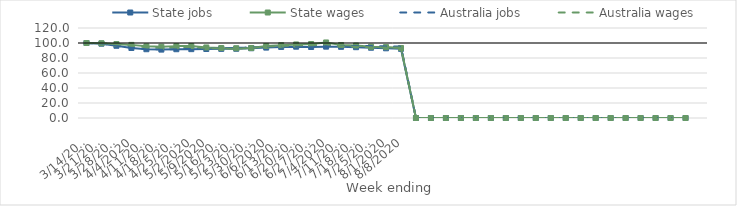
| Category | State jobs | State wages | Australia jobs | Australia wages |
|---|---|---|---|---|
| 14/03/2020 | 100 | 100 | 100 | 100 |
| 21/03/2020 | 99.082 | 99.651 | 99.296 | 99.679 |
| 28/03/2020 | 96.295 | 98.614 | 96.376 | 98.416 |
| 04/04/2020 | 93.333 | 97.498 | 93.719 | 96.743 |
| 11/04/2020 | 91.701 | 95.534 | 91.949 | 94.153 |
| 18/04/2020 | 91.188 | 95.025 | 91.46 | 94.028 |
| 25/04/2020 | 91.693 | 95.834 | 91.774 | 94.242 |
| 02/05/2020 | 91.81 | 96.005 | 92.164 | 94.699 |
| 09/05/2020 | 91.983 | 94.061 | 92.706 | 93.349 |
| 16/05/2020 | 92.169 | 93.309 | 93.235 | 92.689 |
| 23/05/2020 | 92.317 | 92.999 | 93.534 | 92.291 |
| 30/05/2020 | 92.991 | 93.321 | 94.056 | 93.572 |
| 06/06/2020 | 93.873 | 96.082 | 94.996 | 95.371 |
| 13/06/2020 | 94.751 | 97.077 | 95.462 | 96.012 |
| 20/06/2020 | 95.069 | 98.062 | 95.685 | 96.877 |
| 27/06/2020 | 94.651 | 98.651 | 95.589 | 96.891 |
| 04/07/2020 | 95.137 | 100.712 | 96.048 | 98.279 |
| 11/07/2020 | 94.889 | 97.348 | 96.137 | 95.659 |
| 18/07/2020 | 94.402 | 96.679 | 95.918 | 95.021 |
| 25/07/2020 | 93.7 | 94.991 | 95.887 | 94.374 |
| 01/08/2020 | 92.925 | 94.538 | 95.429 | 94.068 |
| 08/08/2020 | 92.228 | 93.348 | 95.147 | 93.816 |